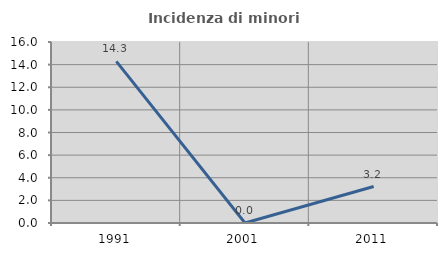
| Category | Incidenza di minori stranieri |
|---|---|
| 1991.0 | 14.286 |
| 2001.0 | 0 |
| 2011.0 | 3.226 |